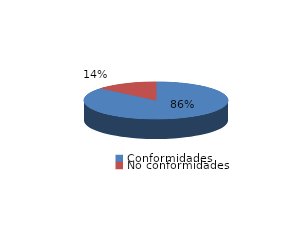
| Category | Series 0 |
|---|---|
| Conformidades | 597 |
| No conformidades | 96 |